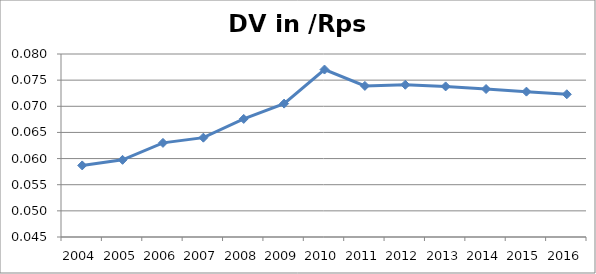
| Category | DV in /Rps in |
|---|---|
| 2004.0 | 0.059 |
| 2005.0 | 0.06 |
| 2006.0 | 0.063 |
| 2007.0 | 0.064 |
| 2008.0 | 0.068 |
| 2009.0 | 0.071 |
| 2010.0 | 0.077 |
| 2011.0 | 0.074 |
| 2012.0 | 0.074 |
| 2013.0 | 0.074 |
| 2014.0 | 0.073 |
| 2015.0 | 0.073 |
| 2016.0 | 0.072 |